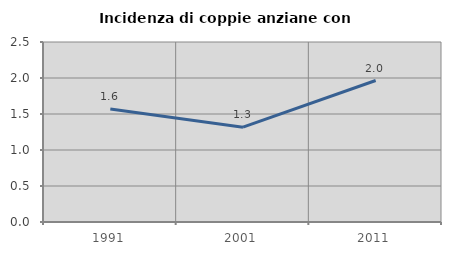
| Category | Incidenza di coppie anziane con figli |
|---|---|
| 1991.0 | 1.57 |
| 2001.0 | 1.317 |
| 2011.0 | 1.965 |